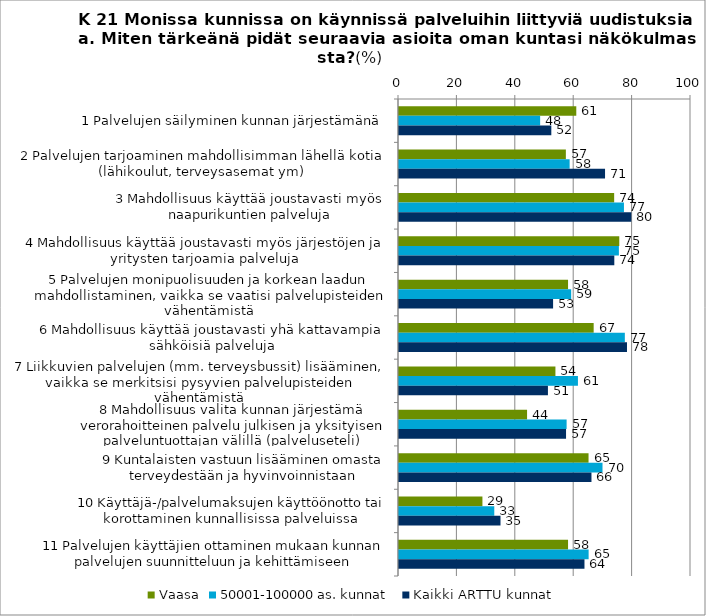
| Category | Vaasa | 50001-100000 as. kunnat | Kaikki ARTTU kunnat |
|---|---|---|---|
| 1 Palvelujen säilyminen kunnan järjestämänä | 60.714 | 48.338 | 52.163 |
| 2 Palvelujen tarjoaminen mahdollisimman lähellä kotia (lähikoulut, terveysasemat ym) | 57.143 | 58.434 | 70.562 |
| 3 Mahdollisuus käyttää joustavasti myös naapurikuntien palveluja | 73.684 | 77.039 | 79.56 |
| 4 Mahdollisuus käyttää joustavasti myös järjestöjen ja yritysten tarjoamia palveluja | 75.439 | 75.301 | 73.735 |
| 5 Palvelujen monipuolisuuden ja korkean laadun mahdollistaminen, vaikka se vaatisi palvelupisteiden vähentämistä | 57.895 | 58.967 | 52.771 |
| 6 Mahdollisuus käyttää joustavasti yhä kattavampia sähköisiä palveluja | 66.667 | 77.341 | 78.079 |
| 7 Liikkuvien palvelujen (mm. terveysbussit) lisääminen, vaikka se merkitsisi pysyvien palvelupisteiden vähentämistä | 53.571 | 61.28 | 51.005 |
| 8 Mahdollisuus valita kunnan järjestämä verorahoitteinen palvelu julkisen ja yksityisen palveluntuottajan välillä (palveluseteli) | 43.86 | 57.402 | 57.207 |
| 9 Kuntalaisten vastuun lisääminen omasta terveydestään ja hyvinvoinnistaan | 64.912 | 69.697 | 65.913 |
| 10 Käyttäjä-/palvelumaksujen käyttöönotto tai korottaminen kunnallisissa palveluissa | 28.571 | 32.628 | 34.76 |
| 11 Palvelujen käyttäjien ottaminen mukaan kunnan palvelujen suunnitteluun ja kehittämiseen | 57.895 | 64.939 | 63.519 |